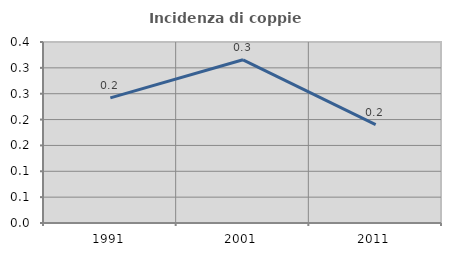
| Category | Incidenza di coppie miste |
|---|---|
| 1991.0 | 0.242 |
| 2001.0 | 0.316 |
| 2011.0 | 0.19 |